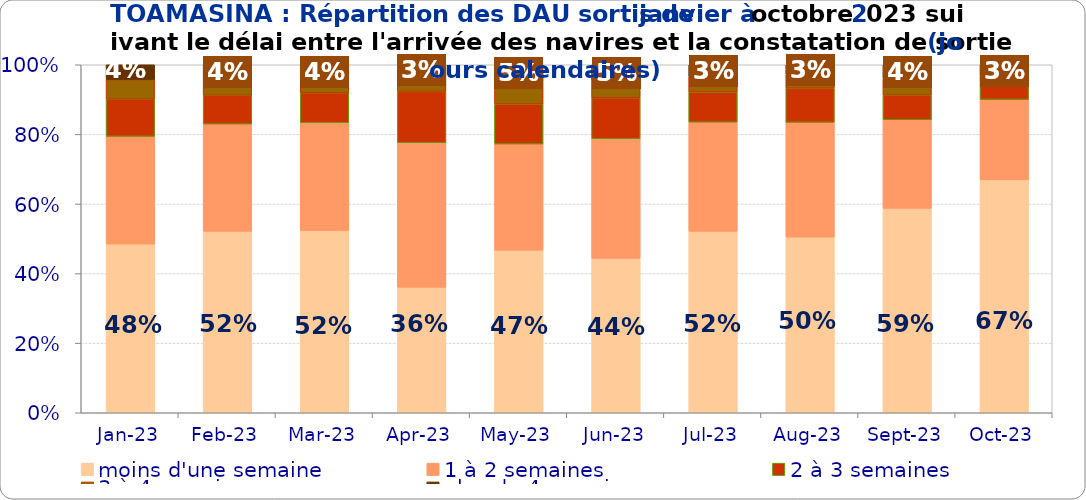
| Category | moins d'une semaine | 1 à 2 semaines | 2 à 3 semaines | 3 à 4 semaines | plus de 4 semaines |
|---|---|---|---|---|---|
| 2023-01-01 | 0.485 | 0.31 | 0.107 | 0.057 | 0.042 |
| 2023-02-01 | 0.521 | 0.309 | 0.083 | 0.047 | 0.041 |
| 2023-03-01 | 0.524 | 0.309 | 0.086 | 0.041 | 0.039 |
| 2023-04-01 | 0.361 | 0.415 | 0.147 | 0.046 | 0.03 |
| 2023-05-01 | 0.467 | 0.305 | 0.115 | 0.064 | 0.049 |
| 2023-06-01 | 0.444 | 0.343 | 0.118 | 0.048 | 0.047 |
| 2023-07-01 | 0.521 | 0.314 | 0.087 | 0.044 | 0.034 |
| 2023-08-01 | 0.505 | 0.33 | 0.098 | 0.04 | 0.028 |
| 2023-09-01 | 0.587 | 0.255 | 0.071 | 0.048 | 0.039 |
| 2023-10-01 | 0.669 | 0.231 | 0.05 | 0.017 | 0.032 |